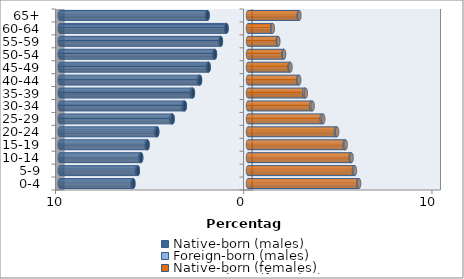
| Category | Native-born (males) | Foreign-born (males) | Native-born (females) | Foreign-born (females) |
|---|---|---|---|---|
| 0-4 | -6.089 | -0.054 | 5.853 | 0.049 |
| 5-9 | -5.853 | -0.054 | 5.629 | 0.05 |
| 10-14 | -5.676 | -0.049 | 5.458 | 0.046 |
| 15-19 | -5.337 | -0.053 | 5.138 | 0.05 |
| 20-24 | -4.822 | -0.067 | 4.671 | 0.064 |
| 25-29 | -4.004 | -0.081 | 3.922 | 0.076 |
| 30-34 | -3.357 | -0.086 | 3.354 | 0.079 |
| 35-39 | -2.926 | -0.082 | 2.999 | 0.073 |
| 40-44 | -2.548 | -0.067 | 2.664 | 0.058 |
| 45-49 | -2.089 | -0.049 | 2.216 | 0.041 |
| 50-54 | -1.756 | -0.035 | 1.887 | 0.029 |
| 55-59 | -1.44 | -0.027 | 1.586 | 0.023 |
| 60-64 | -1.142 | -0.022 | 1.293 | 0.02 |
| 65+ | -2.145 | -0.03 | 2.699 | 0.03 |